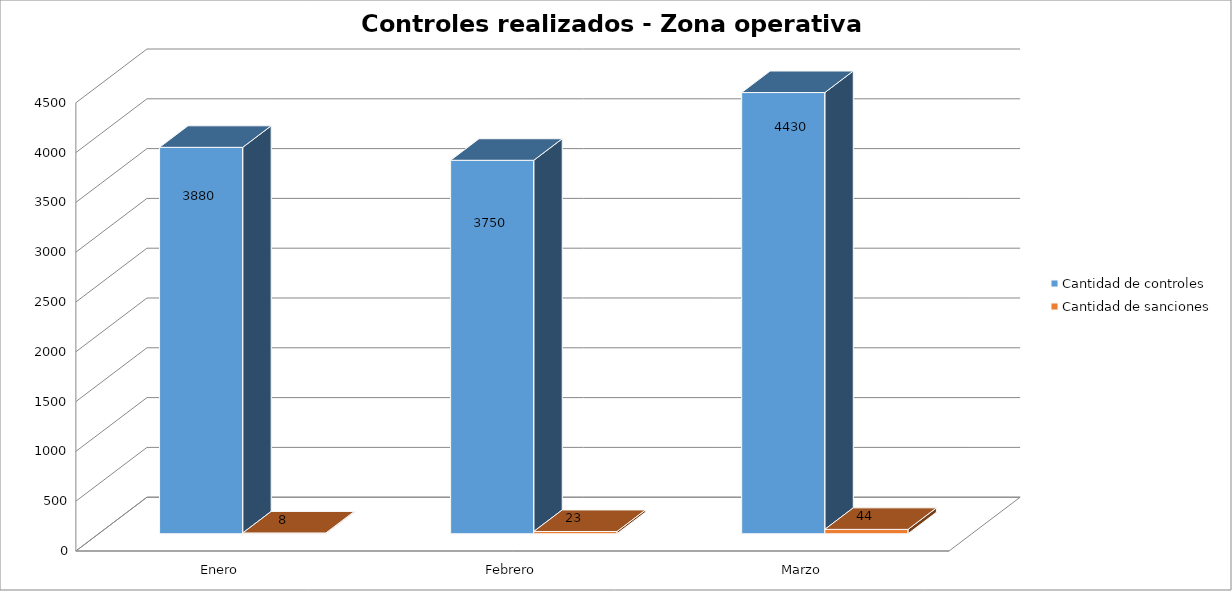
| Category | Cantidad de controles | Cantidad de sanciones |
|---|---|---|
| Enero | 3880 | 8 |
| Febrero | 3750 | 23 |
| Marzo | 4430 | 44 |